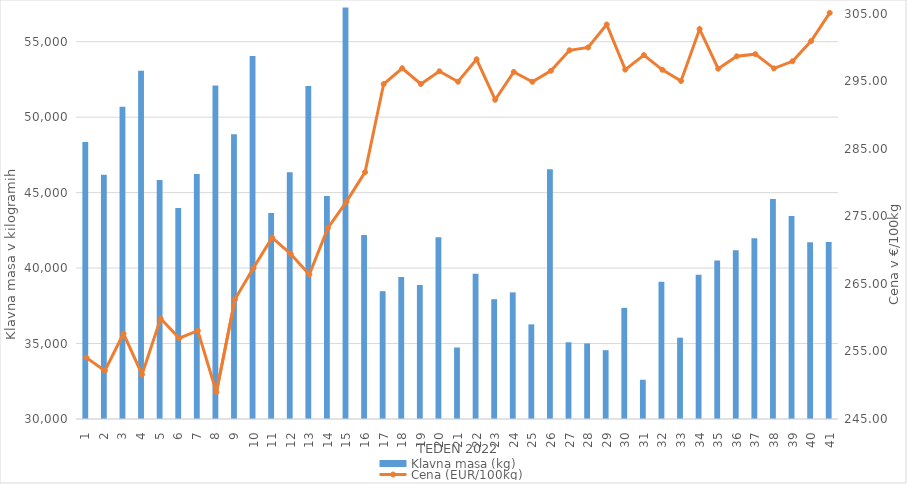
| Category | Klavna masa (kg) |
|---|---|
| 1.0 | 48349 |
| 2.0 | 46187 |
| 3.0 | 50692 |
| 4.0 | 53081 |
| 5.0 | 45844 |
| 6.0 | 43982 |
| 7.0 | 46227 |
| 8.0 | 52099 |
| 9.0 | 48872 |
| 10.0 | 54045 |
| 11.0 | 43645 |
| 12.0 | 46350 |
| 13.0 | 52061 |
| 14.0 | 44774 |
| 15.0 | 57268 |
| 16.0 | 42191 |
| 17.0 | 38469 |
| 18.0 | 39417 |
| 19.0 | 38876 |
| 20.0 | 42047 |
| 21.0 | 34739 |
| 22.0 | 39626 |
| 23.0 | 37939 |
| 24.0 | 38390 |
| 25.0 | 36272 |
| 26.0 | 46553 |
| 27.0 | 35085 |
| 28.0 | 35007 |
| 29.0 | 34559 |
| 30.0 | 37366 |
| 31.0 | 32599 |
| 32.0 | 39100 |
| 33.0 | 35388 |
| 34.0 | 39563 |
| 35.0 | 40507 |
| 36.0 | 41176 |
| 37.0 | 41983 |
| 38.0 | 44572 |
| 39.0 | 43447 |
| 40.0 | 41711 |
| 41.0 | 41736 |